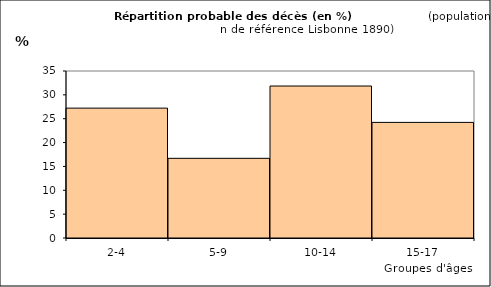
| Category | Series 0 |
|---|---|
| 2-4 | 27.219 |
| 5-9 | 16.701 |
| 10-14 | 31.851 |
| 15-17 | 24.229 |